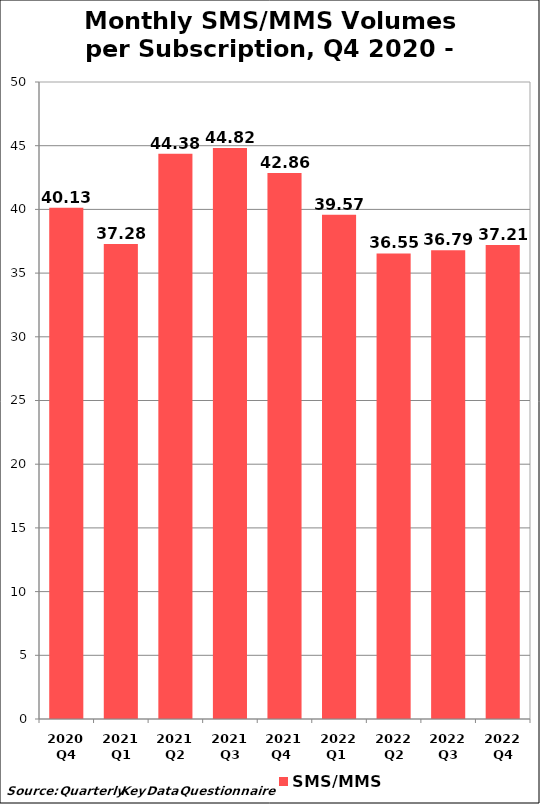
| Category | SMS/MMS |
|---|---|
| 2020 Q4 | 40.134 |
| 2021 Q1 | 37.282 |
| 2021 Q2 | 44.376 |
| 2021 Q3 | 44.822 |
| 2021 Q4  | 42.864 |
| 2022 Q1  | 39.574 |
| 2022 Q2 | 36.546 |
| 2022 Q3 | 36.789 |
| 2022 Q4 | 37.208 |